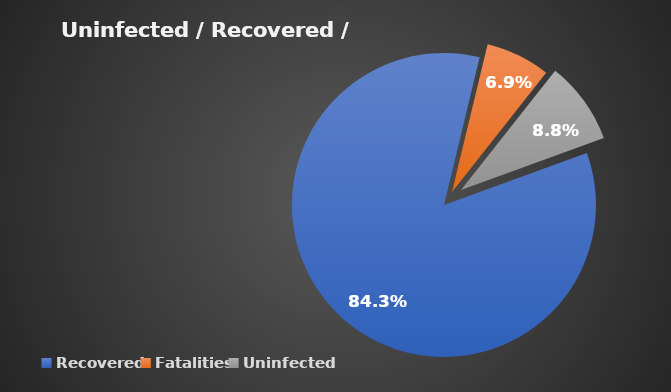
| Category | Series 0 |
|---|---|
| 0 | 0.843 |
| 1 | 0.069 |
| 2 | 0.088 |